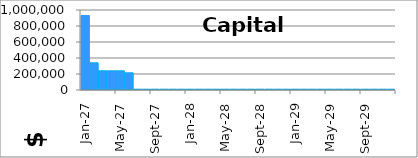
| Category | Cashstream 2: Capital Costs |
|---|---|
| 2027-01-01 | 931000 |
| 2027-02-01 | 340000 |
| 2027-03-01 | 240000 |
| 2027-04-01 | 240000 |
| 2027-05-01 | 240000 |
| 2027-06-01 | 215000 |
| 2027-07-01 | 10000 |
| 2027-08-01 | 10000 |
| 2027-09-01 | 10000 |
| 2027-10-01 | 10000 |
| 2027-11-01 | 10000 |
| 2027-12-01 | 10000 |
| 2028-01-01 | 10000 |
| 2028-02-01 | 10000 |
| 2028-03-01 | 10000 |
| 2028-04-01 | 10000 |
| 2028-05-01 | 10000 |
| 2028-06-01 | 10000 |
| 2028-07-01 | 10000 |
| 2028-08-01 | 10000 |
| 2028-09-01 | 10000 |
| 2028-10-01 | 10000 |
| 2028-11-01 | 10000 |
| 2028-12-01 | 10000 |
| 2029-01-01 | 10000 |
| 2029-02-01 | 10000 |
| 2029-03-01 | 10000 |
| 2029-04-01 | 10000 |
| 2029-05-01 | 10000 |
| 2029-06-01 | 10000 |
| 2029-07-01 | 10000 |
| 2029-08-01 | 10000 |
| 2029-09-01 | 10000 |
| 2029-10-01 | 10000 |
| 2029-11-01 | 10000 |
| 2029-12-01 | 10000 |